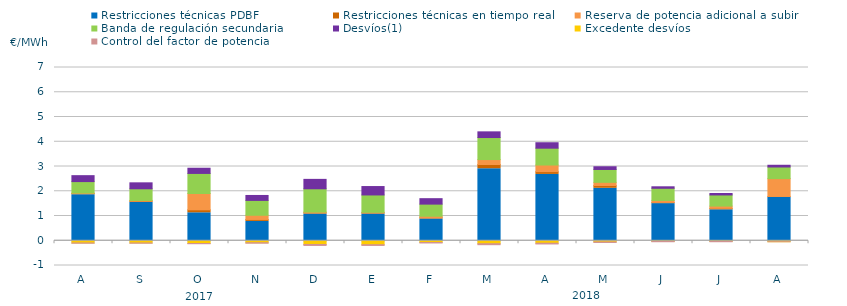
| Category | Restricciones técnicas PDBF | Restricciones técnicas en tiempo real | Reserva de potencia adicional a subir | Banda de regulación secundaria | Desvíos(1) | Excedente desvíos | Control del factor de potencia |
|---|---|---|---|---|---|---|---|
| A | 1.86 | 0.05 | 0.02 | 0.46 | 0.24 | -0.09 | -0.05 |
| S | 1.55 | 0.05 | 0.03 | 0.47 | 0.24 | -0.09 | -0.05 |
| O | 1.13 | 0.12 | 0.66 | 0.81 | 0.21 | -0.11 | -0.05 |
| N | 0.78 | 0.08 | 0.17 | 0.6 | 0.2 | -0.08 | -0.06 |
| D | 1.08 | 0.05 | 0.03 | 0.94 | 0.38 | -0.15 | -0.08 |
| E | 1.08 | 0.05 | 0.02 | 0.7 | 0.34 | -0.16 | -0.07 |
| F | 0.88 | 0.05 | 0.06 | 0.49 | 0.22 | -0.07 | -0.06 |
| M | 2.91 | 0.17 | 0.2 | 0.89 | 0.23 | -0.12 | -0.08 |
| A | 2.68 | 0.11 | 0.27 | 0.68 | 0.22 | -0.1 | -0.07 |
| M | 2.12 | 0.11 | 0.13 | 0.52 | 0.11 | -0.05 | -0.06 |
| J | 1.5 | 0.05 | 0.08 | 0.49 | 0.06 | -0.03 | -0.05 |
| J | 1.25 | 0.06 | 0.09 | 0.45 | 0.06 | -0.03 | -0.05 |
| A | 1.75 | 0.04 | 0.72 | 0.47 | 0.07 | -0.04 | -0.04 |